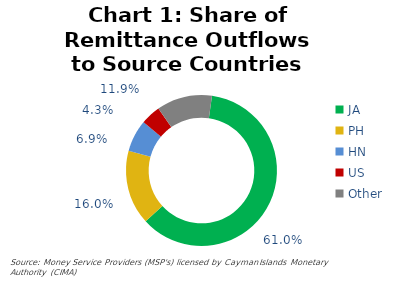
| Category | Chart 1: Share of Remittance Outflows to Source Countries 2022Q4 |
|---|---|
| JA | 0.61 |
| PH | 0.16 |
| HN | 0.069 |
| US | 0.043 |
| Other | 0.119 |